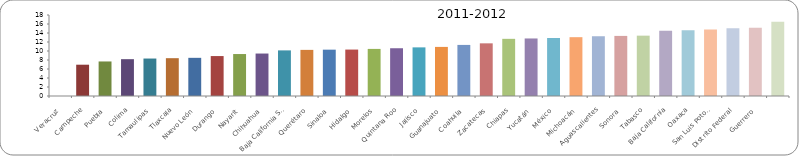
| Category | 2011-2012 |
|---|---|
| Veracruz | 0 |
| Campeche | 6.955 |
| Puebla | 7.675 |
| Colima | 8.183 |
| Tamaulipas | 8.325 |
| Tlaxcala | 8.404 |
| Nuevo León | 8.482 |
| Durango | 8.876 |
| Nayarit | 9.325 |
| Chihuahua | 9.436 |
| Baja California Sur | 10.137 |
| Querétaro | 10.248 |
| Sinaloa | 10.297 |
| Hidalgo | 10.318 |
| Morelos | 10.465 |
| Quintana Roo | 10.613 |
| Jalisco | 10.806 |
| Guanajuato | 10.909 |
| Coahuila | 11.352 |
| Zacatecas | 11.703 |
| Chiapas | 12.704 |
| Yucatán | 12.785 |
| México | 12.893 |
| Michoacán | 13.073 |
| Aguascalientes | 13.279 |
| Sonora | 13.353 |
| Tabasco | 13.411 |
| Baja California | 14.483 |
| Oaxaca | 14.592 |
| San Luis Potosí | 14.781 |
| Distrito Federal | 15.033 |
| Guerrero | 15.175 |